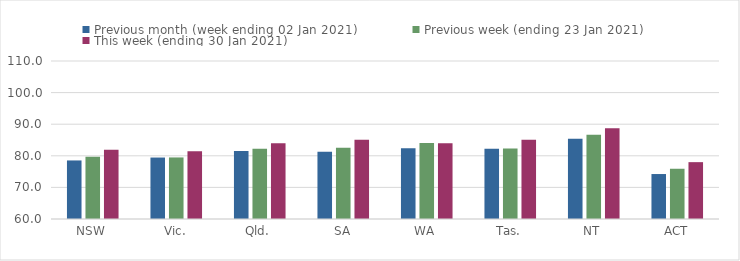
| Category | Previous month (week ending 02 Jan 2021) | Previous week (ending 23 Jan 2021) | This week (ending 30 Jan 2021) |
|---|---|---|---|
| NSW | 78.53 | 79.7 | 81.88 |
| Vic. | 79.45 | 79.48 | 81.41 |
| Qld. | 81.48 | 82.21 | 83.97 |
| SA | 81.25 | 82.53 | 85.06 |
| WA | 82.38 | 84.09 | 83.98 |
| Tas. | 82.21 | 82.33 | 85.04 |
| NT | 85.41 | 86.66 | 88.7 |
| ACT | 74.23 | 75.9 | 77.99 |